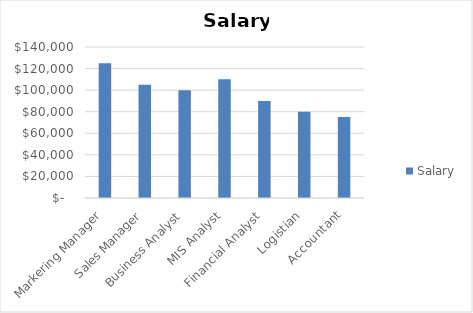
| Category | Salary |
|---|---|
| Markering Manager | 125000 |
| Sales Manager | 105000 |
| Business Analyst | 100000 |
| MIS Analyst | 110000 |
| Financial Analyst | 90000 |
| Logistian | 80000 |
| Accountant | 75000 |